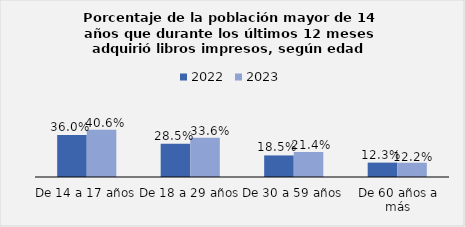
| Category | 2022 | 2023 |
|---|---|---|
| De 14 a 17 años | 0.36 | 0.406 |
| De 18 a 29 años | 0.285 | 0.336 |
| De 30 a 59 años | 0.185 | 0.214 |
| De 60 años a más | 0.123 | 0.122 |